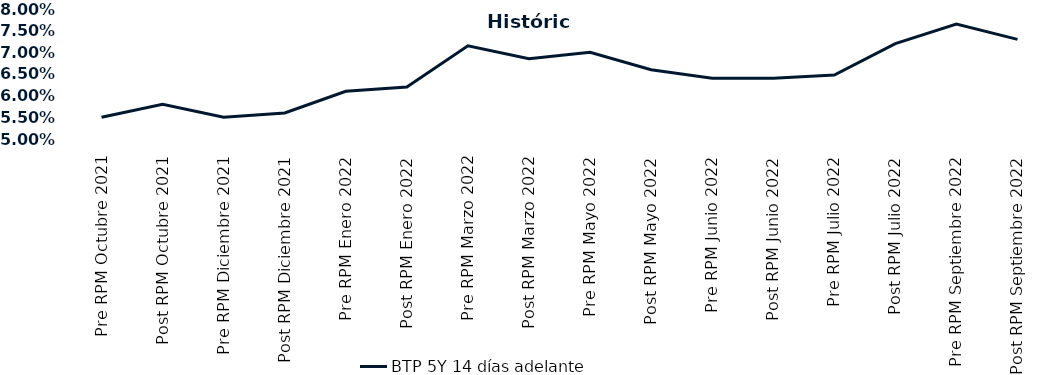
| Category | BTP 5Y 14 días adelante |
|---|---|
| Pre RPM Octubre 2021 | 0.055 |
| Post RPM Octubre 2021 | 0.058 |
| Pre RPM Diciembre 2021 | 0.055 |
| Post RPM Diciembre 2021 | 0.056 |
| Pre RPM Enero 2022 | 0.061 |
| Post RPM Enero 2022 | 0.062 |
| Pre RPM Marzo 2022 | 0.072 |
| Post RPM Marzo 2022 | 0.068 |
| Pre RPM Mayo 2022 | 0.07 |
| Post RPM Mayo 2022 | 0.066 |
| Pre RPM Junio 2022 | 0.064 |
| Post RPM Junio 2022 | 0.064 |
| Pre RPM Julio 2022 | 0.065 |
| Post RPM Julio 2022 | 0.072 |
| Pre RPM Septiembre 2022 | 0.076 |
| Post RPM Septiembre 2022 | 0.073 |